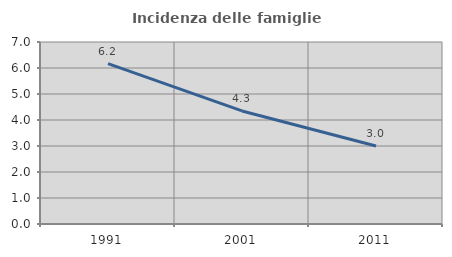
| Category | Incidenza delle famiglie numerose |
|---|---|
| 1991.0 | 6.17 |
| 2001.0 | 4.348 |
| 2011.0 | 2.997 |